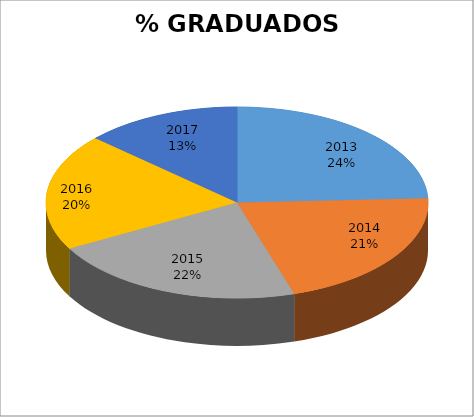
| Category | Series 0 |
|---|---|
| 2013.0 | 128 |
| 2014.0 | 110 |
| 2015.0 | 115 |
| 2016.0 | 104 |
| 2017.0 | 70 |